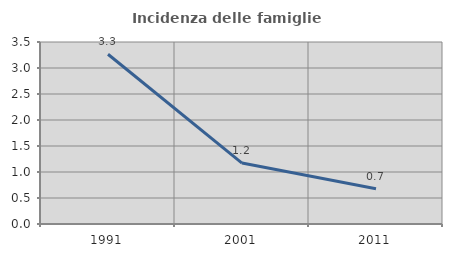
| Category | Incidenza delle famiglie numerose |
|---|---|
| 1991.0 | 3.265 |
| 2001.0 | 1.171 |
| 2011.0 | 0.676 |